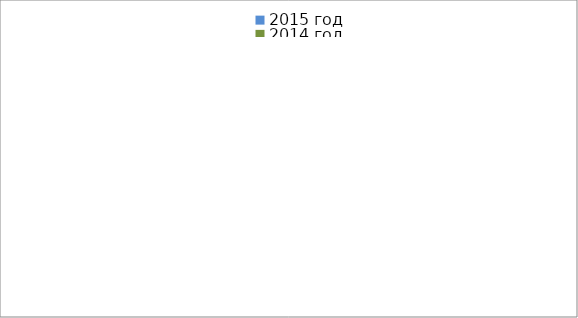
| Category | 2015 год | 2014 год |
|---|---|---|
|  - поджог | 14 | 14 |
|  - неосторожное обращение с огнём | 42 | 24 |
|  - НПТЭ электрооборудования | 8 | 15 |
|  - НПУ и Э печей | 40 | 45 |
|  - НПУ и Э транспортных средств | 36 | 44 |
|   -Шалость с огнем детей | 3 | 0 |
|  -НППБ при эксплуатации эл.приборов | 11 | 16 |
|  - курение | 17 | 17 |
| - прочие | 59 | 69 |
| - не установленные причины | 5 | 7 |